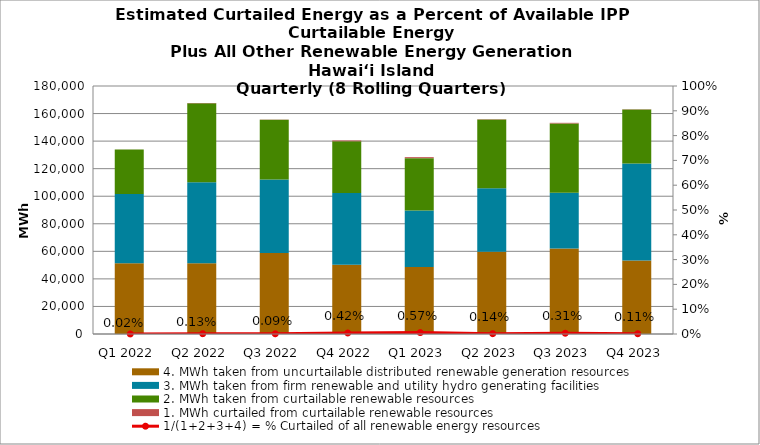
| Category | 4. MWh taken from uncurtailable distributed renewable generation resources | 3. MWh taken from firm renewable and utility hydro generating facilities | 2. MWh taken from curtailable renewable resources | 1. MWh curtailed from curtailable renewable resources |
|---|---|---|---|---|
| Q1 2022 | 51390.813 | 50312.745 | 32210.941 | 26 |
| Q2 2022 | 51318.559 | 58775.327 | 57318.619 | 216 |
| Q3 2022 | 58866.615 | 53346.192 | 43259.087 | 142 |
| Q4 2022 | 50275.954 | 52008.714 | 37591.104 | 584 |
| Q1 2023 | 48551.575 | 41168.197 | 37915.286 | 716 |
| Q2 2023 | 59696.979 | 46136.177 | 49938.237 | 214 |
| Q3 2023 | 62081.827 | 40527.694 | 50199.007 | 462.421 |
| Q4 2023 | 53433.902 | 70250.578 | 39307.591 | 174 |